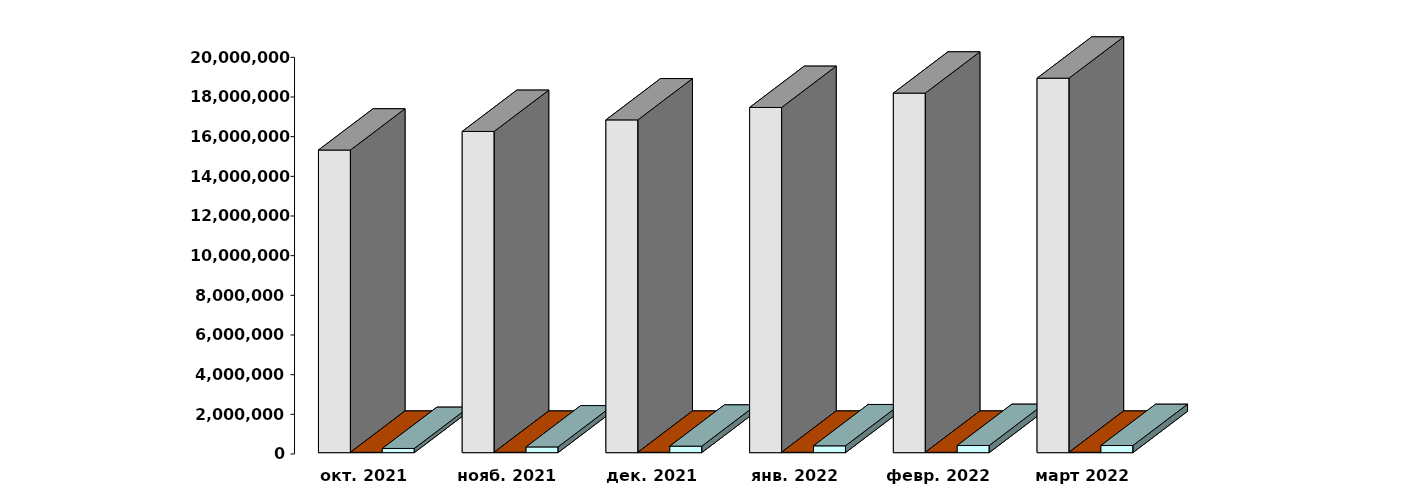
| Category | Физические лица | Юридические лица | Клиенты, передавшие свои средства в ДУ |
|---|---|---|---|
| 2021-10-28 | 15258509 | 20154 | 212008 |
| 2021-11-28 | 16196130 | 20272 | 288895 |
| 2021-12-28 | 16779069 | 20446 | 327432 |
| 2022-01-28 | 17405817 | 20536 | 345411 |
| 2022-02-28 | 18128529 | 20698 | 361205 |
| 2022-03-31 | 18881687 | 21131 | 360205 |